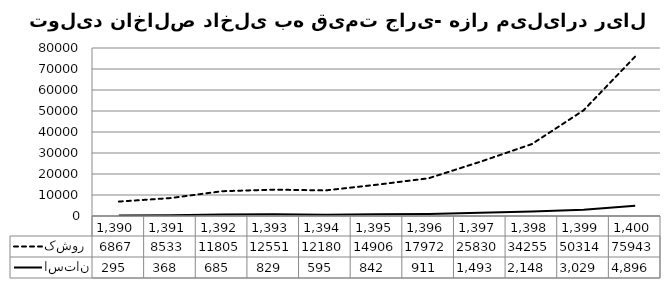
| Category | کشور | استان |
|---|---|---|
| 1390.0 | 6866.811 | 294.508 |
| 1391.0 | 8533.392 | 368.168 |
| 1392.0 | 11804.886 | 685.419 |
| 1393.0 | 12550.96 | 829.107 |
| 1394.0 | 12180.016 | 594.623 |
| 1395.0 | 14906.258 | 842.42 |
| 1396.0 | 17971.871 | 911.077 |
| 1397.0 | 25829.712 | 1492.515 |
| 1398.0 | 34255.009 | 2148.365 |
| 1399.0 | 50314.21 | 3029.398 |
| 1400.0 | 75943.232 | 4896.235 |